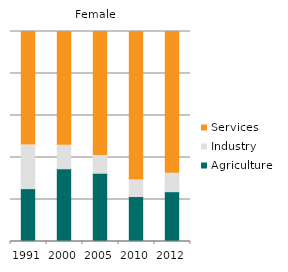
| Category | Agriculture | Industry | Services |
|---|---|---|---|
| 1991.0 | 25.171 | 20.739 | 54.089 |
| 2000.0 | 34.637 | 11.222 | 54.141 |
| 2005.0 | 32.504 | 8.413 | 59.083 |
| 2010.0 | 21.413 | 7.814 | 70.773 |
| 2012.0 | 23.711 | 8.813 | 67.476 |